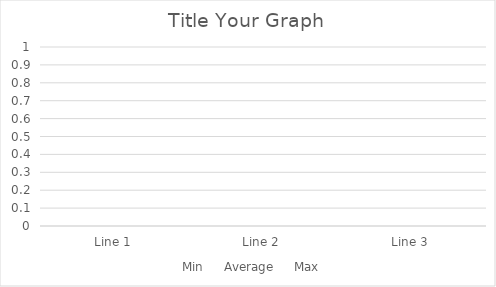
| Category | Min | Average | Max |
|---|---|---|---|
| Line 1 | 0 | 0 | 0 |
| Line 2 | 0 | 0 | 0 |
| Line 3 | 0 | 0 | 0 |